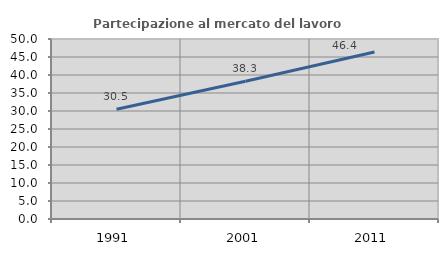
| Category | Partecipazione al mercato del lavoro  femminile |
|---|---|
| 1991.0 | 30.479 |
| 2001.0 | 38.252 |
| 2011.0 | 46.37 |